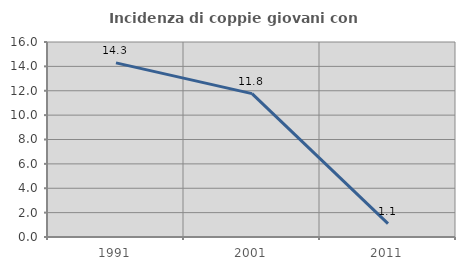
| Category | Incidenza di coppie giovani con figli |
|---|---|
| 1991.0 | 14.286 |
| 2001.0 | 11.765 |
| 2011.0 | 1.099 |